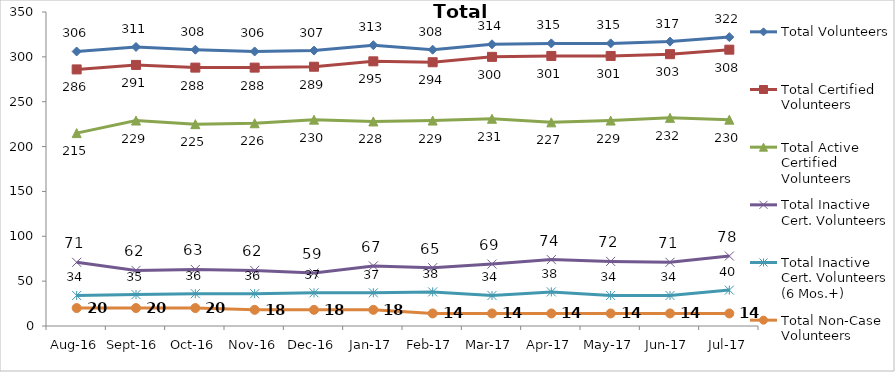
| Category | Total Volunteers | Total Certified Volunteers | Total Active Certified Volunteers | Total Inactive Cert. Volunteers | Total Inactive Cert. Volunteers (6 Mos.+) | Total Non-Case Volunteers |
|---|---|---|---|---|---|---|
| Aug-16 | 306 | 286 | 215 | 71 | 34 | 20 |
| Sep-16 | 311 | 291 | 229 | 62 | 35 | 20 |
| Oct-16 | 308 | 288 | 225 | 63 | 36 | 20 |
| Nov-16 | 306 | 288 | 226 | 62 | 36 | 18 |
| Dec-16 | 307 | 289 | 230 | 59 | 37 | 18 |
| Jan-17 | 313 | 295 | 228 | 67 | 37 | 18 |
| Feb-17 | 308 | 294 | 229 | 65 | 38 | 14 |
| Mar-17 | 314 | 300 | 231 | 69 | 34 | 14 |
| Apr-17 | 315 | 301 | 227 | 74 | 38 | 14 |
| May-17 | 315 | 301 | 229 | 72 | 34 | 14 |
| Jun-17 | 317 | 303 | 232 | 71 | 34 | 14 |
| Jul-17 | 322 | 308 | 230 | 78 | 40 | 14 |